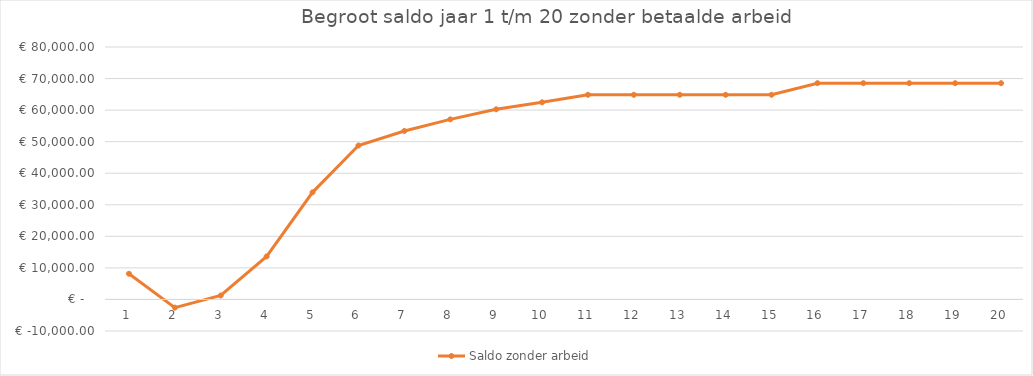
| Category | Saldo zonder arbeid |
|---|---|
| 0 | 8140 |
| 1 | -2597.564 |
| 2 | 1257.705 |
| 3 | 13625.18 |
| 4 | 33945.529 |
| 5 | 48772.575 |
| 6 | 53394.741 |
| 7 | 57069.411 |
| 8 | 60258.216 |
| 9 | 62475.664 |
| 10 | 64859.222 |
| 11 | 64859.222 |
| 12 | 64859.222 |
| 13 | 64859.222 |
| 14 | 64859.222 |
| 15 | 68533.929 |
| 16 | 68533.929 |
| 17 | 68533.929 |
| 18 | 68533.929 |
| 19 | 68533.929 |